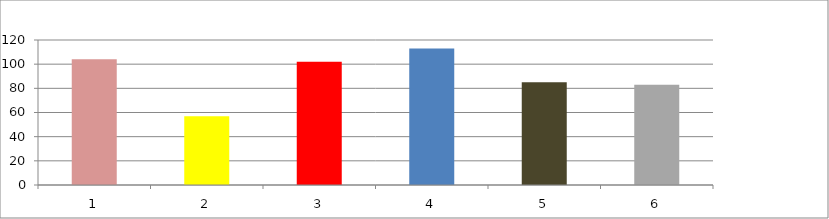
| Category | Series 0 |
|---|---|
| 0 | 104 |
| 1 | 57 |
| 2 | 102 |
| 3 | 113 |
| 4 | 85 |
| 5 | 83 |